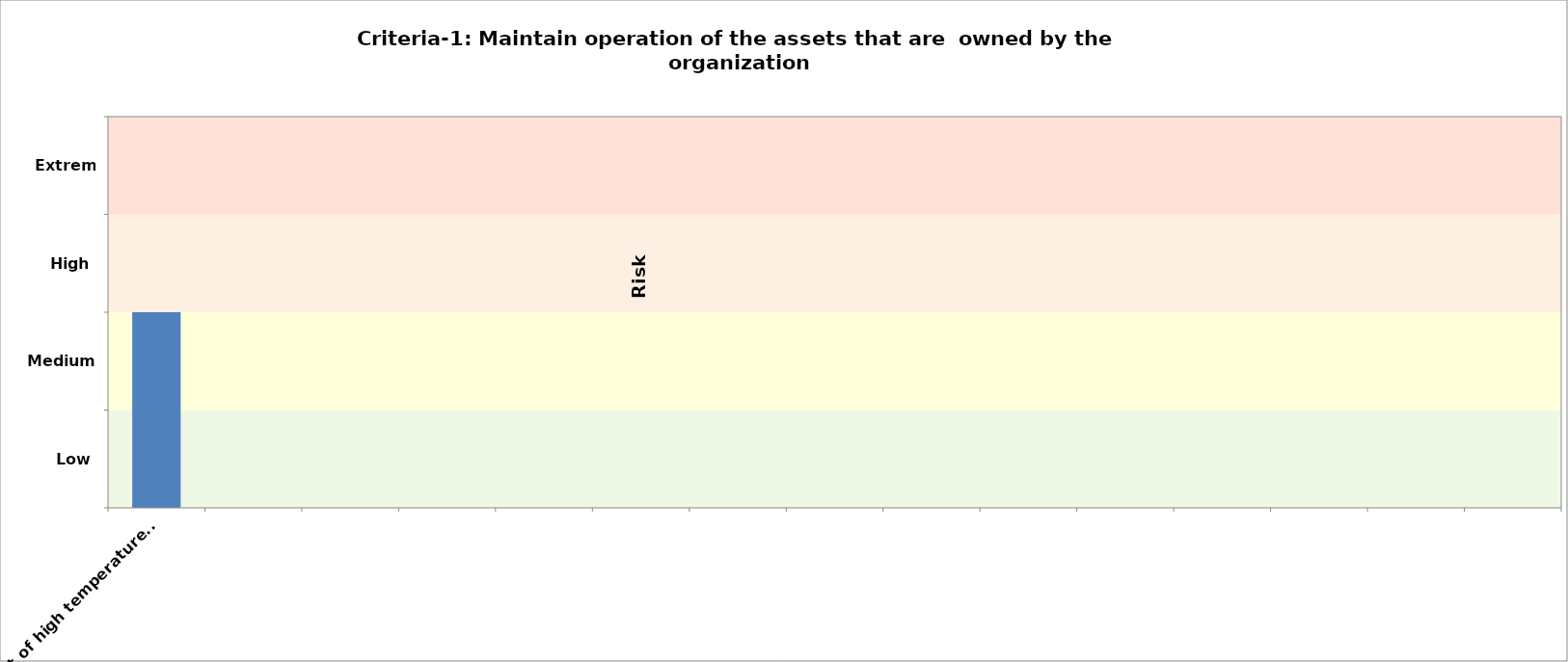
| Category | Criteria-1 2030 |
|---|---|
| e.g. effect of high temperature on road pavement  | 2 |